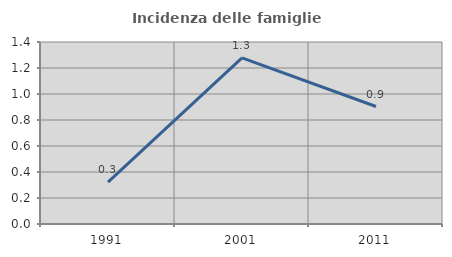
| Category | Incidenza delle famiglie numerose |
|---|---|
| 1991.0 | 0.323 |
| 2001.0 | 1.278 |
| 2011.0 | 0.904 |